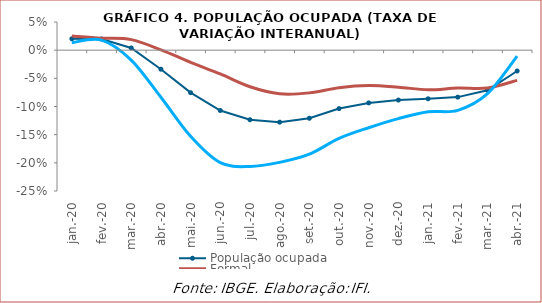
| Category | População ocupada | Formal | Informal |
|---|---|---|---|
| 2020-01-01 | 0.02 | 0.025 | 0.013 |
| 2020-02-01 | 0.02 | 0.021 | 0.018 |
| 2020-03-01 | 0.004 | 0.019 | -0.018 |
| 2020-04-01 | -0.034 | 0.001 | -0.084 |
| 2020-05-01 | -0.075 | -0.022 | -0.153 |
| 2020-06-01 | -0.107 | -0.042 | -0.2 |
| 2020-07-01 | -0.123 | -0.065 | -0.207 |
| 2020-08-01 | -0.128 | -0.077 | -0.199 |
| 2020-09-01 | -0.121 | -0.076 | -0.185 |
| 2020-10-01 | -0.104 | -0.067 | -0.157 |
| 2020-11-01 | -0.094 | -0.063 | -0.138 |
| 2020-12-01 | -0.089 | -0.066 | -0.121 |
| 2021-01-01 | -0.086 | -0.07 | -0.109 |
| 2021-02-01 | -0.083 | -0.067 | -0.107 |
| 2021-03-01 | -0.071 | -0.067 | -0.077 |
| 2021-04-01 | -0.037 | -0.054 | -0.011 |